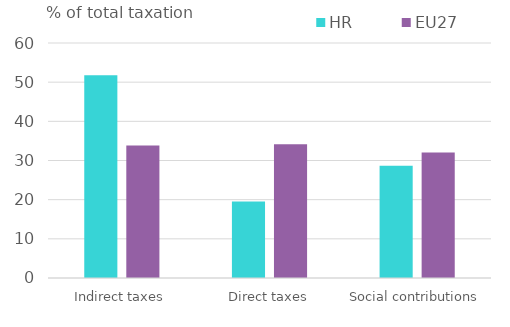
| Category | HR | EU27 |
|---|---|---|
| Indirect taxes | 51.795 | 33.811 |
| Direct taxes | 19.554 | 34.133 |
| Social contributions | 28.65 | 32.056 |